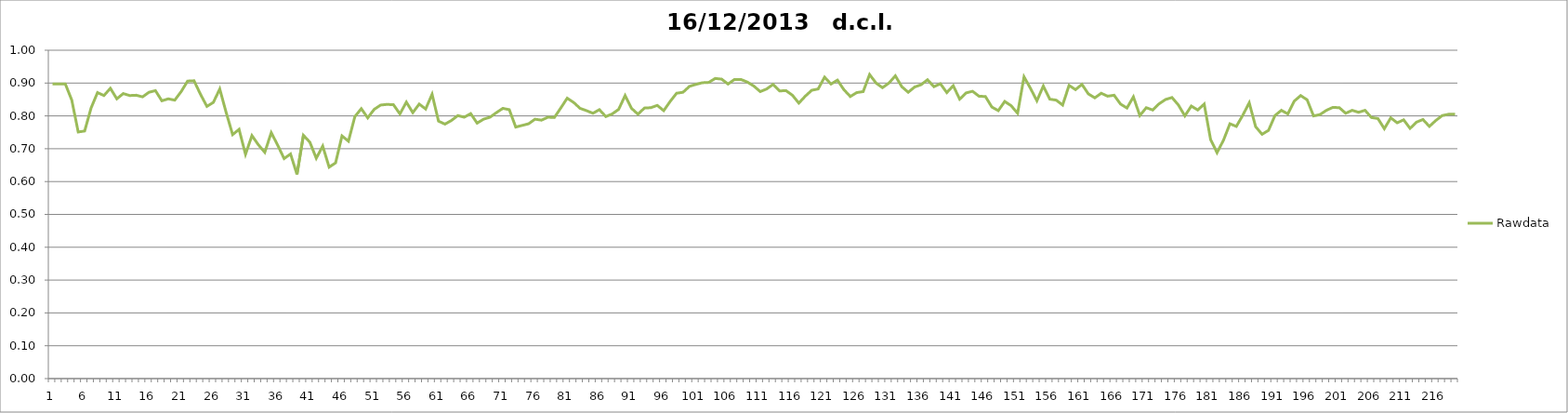
| Category | Rawdata |
|---|---|
| 0 | 0.897 |
| 1 | 0.897 |
| 2 | 0.897 |
| 3 | 0.848 |
| 4 | 0.751 |
| 5 | 0.754 |
| 6 | 0.824 |
| 7 | 0.871 |
| 8 | 0.862 |
| 9 | 0.884 |
| 10 | 0.852 |
| 11 | 0.868 |
| 12 | 0.862 |
| 13 | 0.863 |
| 14 | 0.858 |
| 15 | 0.872 |
| 16 | 0.877 |
| 17 | 0.846 |
| 18 | 0.852 |
| 19 | 0.848 |
| 20 | 0.874 |
| 21 | 0.906 |
| 22 | 0.907 |
| 23 | 0.866 |
| 24 | 0.829 |
| 25 | 0.841 |
| 26 | 0.882 |
| 27 | 0.81 |
| 28 | 0.743 |
| 29 | 0.759 |
| 30 | 0.683 |
| 31 | 0.74 |
| 32 | 0.712 |
| 33 | 0.689 |
| 34 | 0.749 |
| 35 | 0.711 |
| 36 | 0.67 |
| 37 | 0.684 |
| 38 | 0.622 |
| 39 | 0.741 |
| 40 | 0.72 |
| 41 | 0.671 |
| 42 | 0.708 |
| 43 | 0.644 |
| 44 | 0.657 |
| 45 | 0.739 |
| 46 | 0.723 |
| 47 | 0.798 |
| 48 | 0.822 |
| 49 | 0.794 |
| 50 | 0.82 |
| 51 | 0.833 |
| 52 | 0.835 |
| 53 | 0.834 |
| 54 | 0.806 |
| 55 | 0.842 |
| 56 | 0.81 |
| 57 | 0.836 |
| 58 | 0.821 |
| 59 | 0.866 |
| 60 | 0.784 |
| 61 | 0.775 |
| 62 | 0.786 |
| 63 | 0.801 |
| 64 | 0.796 |
| 65 | 0.807 |
| 66 | 0.778 |
| 67 | 0.79 |
| 68 | 0.796 |
| 69 | 0.81 |
| 70 | 0.823 |
| 71 | 0.819 |
| 72 | 0.766 |
| 73 | 0.771 |
| 74 | 0.776 |
| 75 | 0.79 |
| 76 | 0.787 |
| 77 | 0.796 |
| 78 | 0.795 |
| 79 | 0.824 |
| 80 | 0.854 |
| 81 | 0.841 |
| 82 | 0.823 |
| 83 | 0.816 |
| 84 | 0.808 |
| 85 | 0.819 |
| 86 | 0.798 |
| 87 | 0.806 |
| 88 | 0.82 |
| 89 | 0.862 |
| 90 | 0.823 |
| 91 | 0.805 |
| 92 | 0.824 |
| 93 | 0.825 |
| 94 | 0.832 |
| 95 | 0.816 |
| 96 | 0.844 |
| 97 | 0.869 |
| 98 | 0.872 |
| 99 | 0.89 |
| 100 | 0.896 |
| 101 | 0.901 |
| 102 | 0.902 |
| 103 | 0.914 |
| 104 | 0.912 |
| 105 | 0.897 |
| 106 | 0.911 |
| 107 | 0.911 |
| 108 | 0.903 |
| 109 | 0.891 |
| 110 | 0.874 |
| 111 | 0.882 |
| 112 | 0.896 |
| 113 | 0.876 |
| 114 | 0.877 |
| 115 | 0.863 |
| 116 | 0.839 |
| 117 | 0.86 |
| 118 | 0.878 |
| 119 | 0.882 |
| 120 | 0.918 |
| 121 | 0.897 |
| 122 | 0.909 |
| 123 | 0.88 |
| 124 | 0.859 |
| 125 | 0.871 |
| 126 | 0.874 |
| 127 | 0.926 |
| 128 | 0.9 |
| 129 | 0.886 |
| 130 | 0.9 |
| 131 | 0.922 |
| 132 | 0.889 |
| 133 | 0.872 |
| 134 | 0.888 |
| 135 | 0.895 |
| 136 | 0.91 |
| 137 | 0.889 |
| 138 | 0.898 |
| 139 | 0.871 |
| 140 | 0.892 |
| 141 | 0.851 |
| 142 | 0.87 |
| 143 | 0.875 |
| 144 | 0.86 |
| 145 | 0.859 |
| 146 | 0.827 |
| 147 | 0.816 |
| 148 | 0.844 |
| 149 | 0.831 |
| 150 | 0.808 |
| 151 | 0.919 |
| 152 | 0.884 |
| 153 | 0.846 |
| 154 | 0.891 |
| 155 | 0.851 |
| 156 | 0.848 |
| 157 | 0.833 |
| 158 | 0.893 |
| 159 | 0.88 |
| 160 | 0.896 |
| 161 | 0.867 |
| 162 | 0.855 |
| 163 | 0.869 |
| 164 | 0.86 |
| 165 | 0.863 |
| 166 | 0.836 |
| 167 | 0.824 |
| 168 | 0.858 |
| 169 | 0.801 |
| 170 | 0.825 |
| 171 | 0.818 |
| 172 | 0.837 |
| 173 | 0.85 |
| 174 | 0.856 |
| 175 | 0.833 |
| 176 | 0.8 |
| 177 | 0.83 |
| 178 | 0.818 |
| 179 | 0.836 |
| 180 | 0.728 |
| 181 | 0.688 |
| 182 | 0.726 |
| 183 | 0.776 |
| 184 | 0.768 |
| 185 | 0.802 |
| 186 | 0.84 |
| 187 | 0.767 |
| 188 | 0.744 |
| 189 | 0.756 |
| 190 | 0.801 |
| 191 | 0.817 |
| 192 | 0.806 |
| 193 | 0.845 |
| 194 | 0.862 |
| 195 | 0.849 |
| 196 | 0.8 |
| 197 | 0.804 |
| 198 | 0.817 |
| 199 | 0.826 |
| 200 | 0.825 |
| 201 | 0.808 |
| 202 | 0.817 |
| 203 | 0.811 |
| 204 | 0.817 |
| 205 | 0.795 |
| 206 | 0.792 |
| 207 | 0.761 |
| 208 | 0.794 |
| 209 | 0.779 |
| 210 | 0.788 |
| 211 | 0.762 |
| 212 | 0.781 |
| 213 | 0.789 |
| 214 | 0.768 |
| 215 | 0.786 |
| 216 | 0.801 |
| 217 | 0.805 |
| 218 | 0.805 |